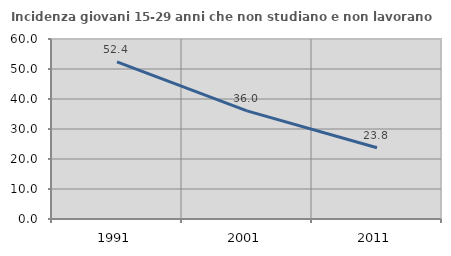
| Category | Incidenza giovani 15-29 anni che non studiano e non lavorano  |
|---|---|
| 1991.0 | 52.381 |
| 2001.0 | 36.023 |
| 2011.0 | 23.76 |